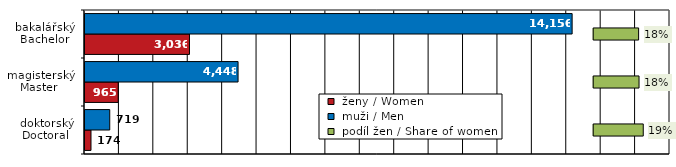
| Category |  ženy / Women |  muži / Men |
|---|---|---|
| doktorský
Doctoral  | 174 | 719 |
| magisterský
Master  | 965 | 4448 |
| bakalářský
Bachelor | 3036 | 14156 |